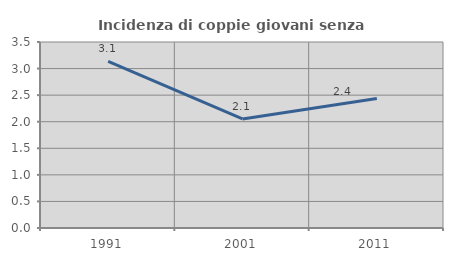
| Category | Incidenza di coppie giovani senza figli |
|---|---|
| 1991.0 | 3.133 |
| 2001.0 | 2.051 |
| 2011.0 | 2.436 |